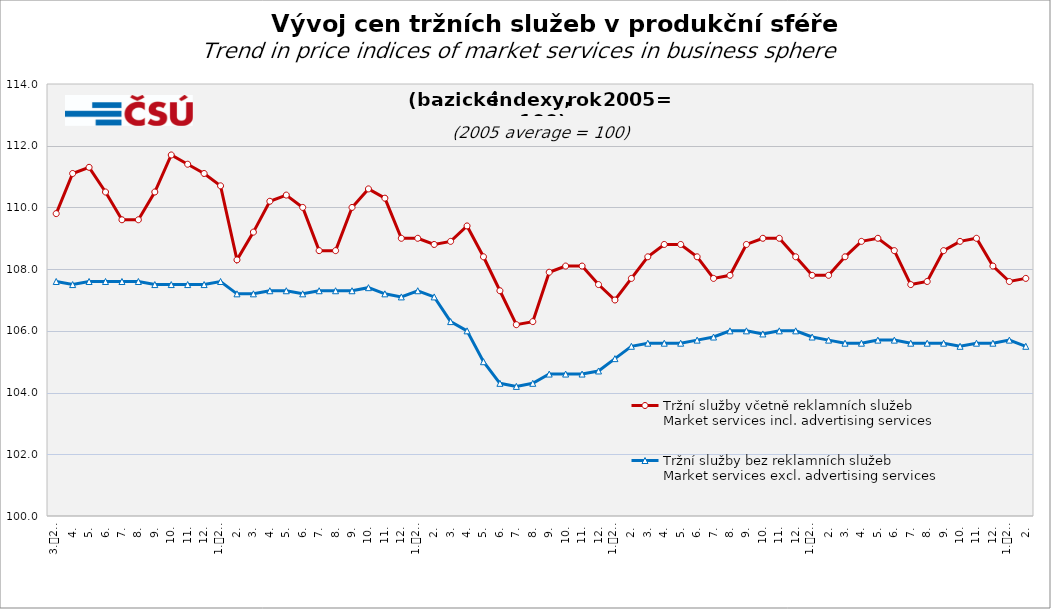
| Category | Tržní služby včetně reklamních služeb
Market services incl. advertising services | Tržní služby bez reklamních služeb
Market services excl. advertising services |
|---|---|---|
| 0 | 109.8 | 107.6 |
| 1 | 111.1 | 107.5 |
| 2 | 111.3 | 107.6 |
| 3 | 110.5 | 107.6 |
| 4 | 109.6 | 107.6 |
| 5 | 109.6 | 107.6 |
| 6 | 110.5 | 107.5 |
| 7 | 111.7 | 107.5 |
| 8 | 111.4 | 107.5 |
| 9 | 111.1 | 107.5 |
| 10 | 110.7 | 107.6 |
| 11 | 108.3 | 107.2 |
| 12 | 109.2 | 107.2 |
| 13 | 110.2 | 107.3 |
| 14 | 110.4 | 107.3 |
| 15 | 110 | 107.2 |
| 16 | 108.6 | 107.3 |
| 17 | 108.6 | 107.3 |
| 18 | 110 | 107.3 |
| 19 | 110.6 | 107.4 |
| 20 | 110.3 | 107.2 |
| 21 | 109 | 107.1 |
| 22 | 109 | 107.3 |
| 23 | 108.8 | 107.1 |
| 24 | 108.9 | 106.3 |
| 25 | 109.4 | 106 |
| 26 | 108.4 | 105 |
| 27 | 107.3 | 104.3 |
| 28 | 106.2 | 104.2 |
| 29 | 106.3 | 104.3 |
| 30 | 107.9 | 104.6 |
| 31 | 108.1 | 104.6 |
| 32 | 108.1 | 104.6 |
| 33 | 107.5 | 104.7 |
| 34 | 107 | 105.1 |
| 35 | 107.7 | 105.5 |
| 36 | 108.4 | 105.6 |
| 37 | 108.8 | 105.6 |
| 38 | 108.8 | 105.6 |
| 39 | 108.4 | 105.7 |
| 40 | 107.7 | 105.8 |
| 41 | 107.8 | 106 |
| 42 | 108.8 | 106 |
| 43 | 109 | 105.9 |
| 44 | 109 | 106 |
| 45 | 108.4 | 106 |
| 46 | 107.8 | 105.8 |
| 47 | 107.8 | 105.7 |
| 48 | 108.4 | 105.6 |
| 49 | 108.9 | 105.6 |
| 50 | 109 | 105.7 |
| 51 | 108.6 | 105.7 |
| 52 | 107.5 | 105.6 |
| 53 | 107.6 | 105.6 |
| 54 | 108.6 | 105.6 |
| 55 | 108.9 | 105.5 |
| 56 | 109 | 105.6 |
| 57 | 108.1 | 105.6 |
| 58 | 107.6 | 105.7 |
| 59 | 107.7 | 105.5 |